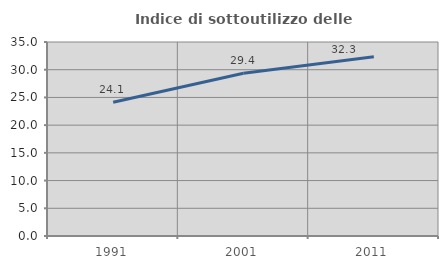
| Category | Indice di sottoutilizzo delle abitazioni  |
|---|---|
| 1991.0 | 24.133 |
| 2001.0 | 29.376 |
| 2011.0 | 32.331 |